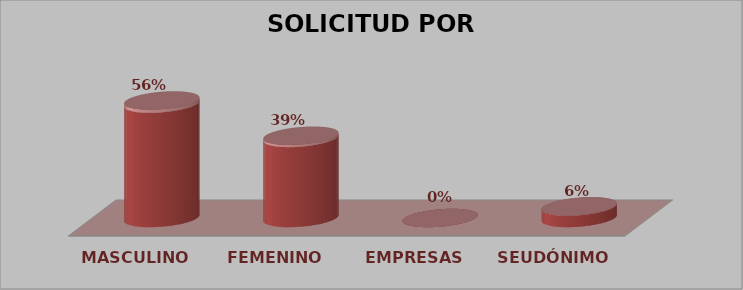
| Category | SOLICITUD POR GÉNERO | Series 1 |
|---|---|---|
| MASCULINO | 20 | 0.556 |
| FEMENINO | 14 | 0.389 |
| EMPRESAS | 0 | 0 |
| SEUDÓNIMO | 2 | 0.056 |